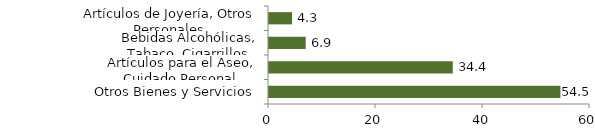
| Category | Otros grupos |
|---|---|
| Otros Bienes y Servicios | 54.469 |
| Artículos para el Aseo, Cuidado Personal | 34.355 |
| Bebidas Alcohólicas, Tabaco, Cigarrillos | 6.862 |
| Artículos de Joyería, Otros Personales | 4.314 |